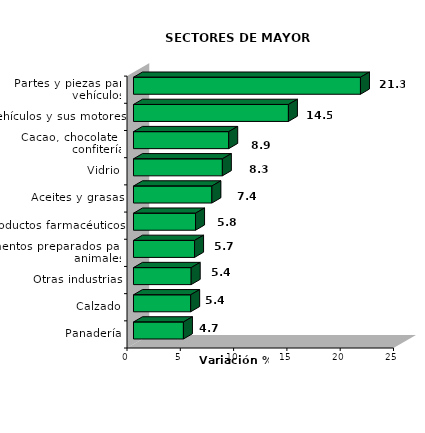
| Category | Series 0 |
|---|---|
| Partes y piezas para vehículos | 21.292 |
| Vehículos y sus motores | 14.533 |
| Cacao, chocolate y confitería | 8.932 |
| Vidrio | 8.337 |
| Aceites y grasas | 7.353 |
| Productos farmacéuticos | 5.821 |
| Alimentos preparados para animales | 5.729 |
| Otras industrias | 5.412 |
| Calzado | 5.363 |
| Panadería | 4.683 |